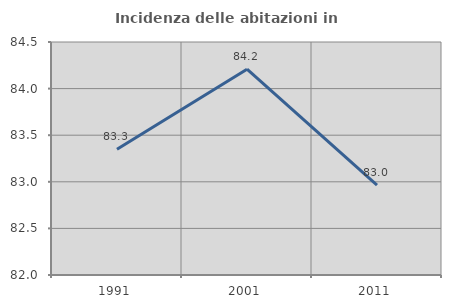
| Category | Incidenza delle abitazioni in proprietà  |
|---|---|
| 1991.0 | 83.349 |
| 2001.0 | 84.208 |
| 2011.0 | 82.964 |